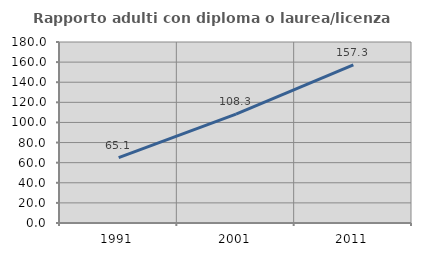
| Category | Rapporto adulti con diploma o laurea/licenza media  |
|---|---|
| 1991.0 | 65.076 |
| 2001.0 | 108.308 |
| 2011.0 | 157.295 |